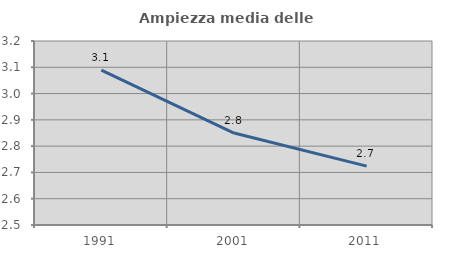
| Category | Ampiezza media delle famiglie |
|---|---|
| 1991.0 | 3.089 |
| 2001.0 | 2.85 |
| 2011.0 | 2.724 |